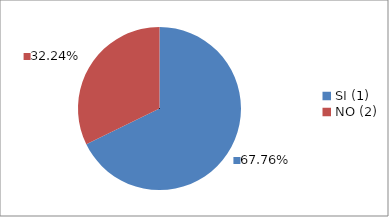
| Category | Series 0 |
|---|---|
| SI (1) | 0.678 |
| NO (2) | 0.322 |